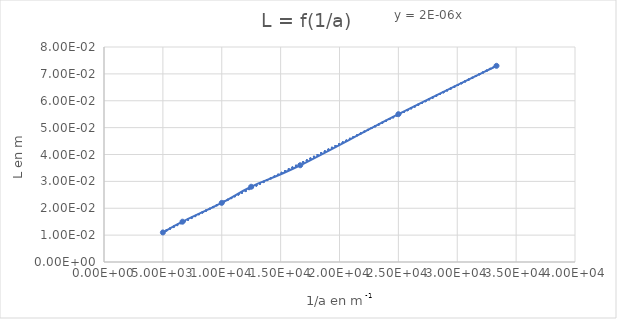
| Category | Series 0 |
|---|---|
| 33333.333333333336 | 0.073 |
| 24999.999999999996 | 0.055 |
| 16666.666666666668 | 0.036 |
| 12499.999999999998 | 0.028 |
| 10000.0 | 0.022 |
| 6666.666666666667 | 0.015 |
| 5000.0 | 0.011 |